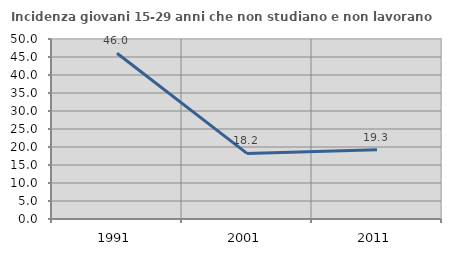
| Category | Incidenza giovani 15-29 anni che non studiano e non lavorano  |
|---|---|
| 1991.0 | 46.032 |
| 2001.0 | 18.214 |
| 2011.0 | 19.269 |